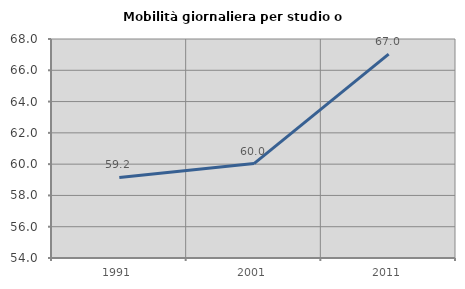
| Category | Mobilità giornaliera per studio o lavoro |
|---|---|
| 1991.0 | 59.151 |
| 2001.0 | 60.036 |
| 2011.0 | 67.036 |